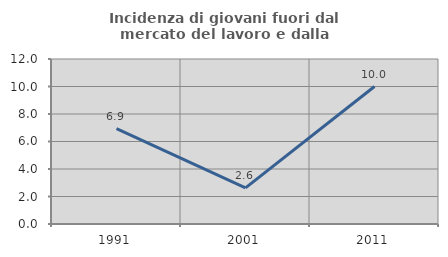
| Category | Incidenza di giovani fuori dal mercato del lavoro e dalla formazione  |
|---|---|
| 1991.0 | 6.931 |
| 2001.0 | 2.632 |
| 2011.0 | 10 |